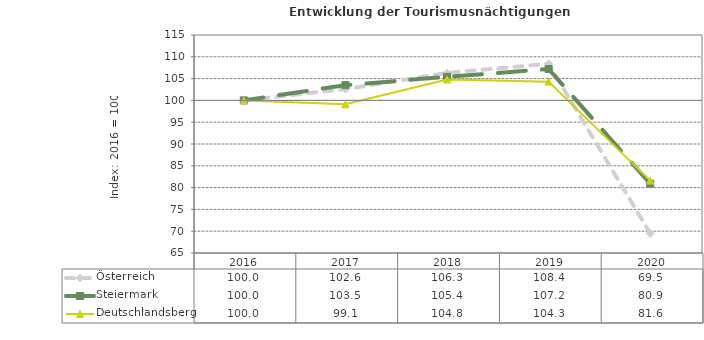
| Category | Österreich | Steiermark | Deutschlandsberg |
|---|---|---|---|
| 2020.0 | 69.5 | 80.9 | 81.6 |
| 2019.0 | 108.4 | 107.2 | 104.3 |
| 2018.0 | 106.3 | 105.4 | 104.8 |
| 2017.0 | 102.6 | 103.5 | 99.1 |
| 2016.0 | 100 | 100 | 100 |